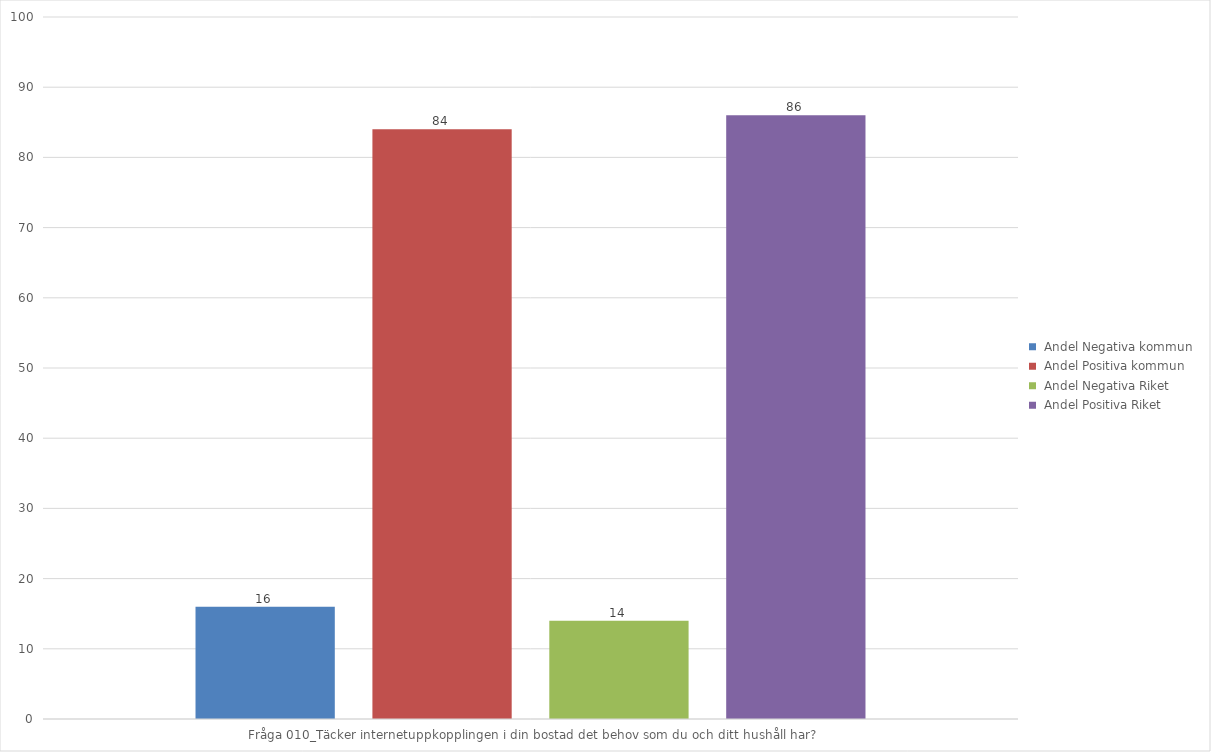
| Category |  Andel Negativa kommun |  Andel Positiva kommun |  Andel Negativa Riket |  Andel Positiva Riket |
|---|---|---|---|---|
| Fråga 010_Täcker internetuppkopplingen i din bostad det behov som du och ditt hushåll har? | 16 | 84 | 14 | 86 |